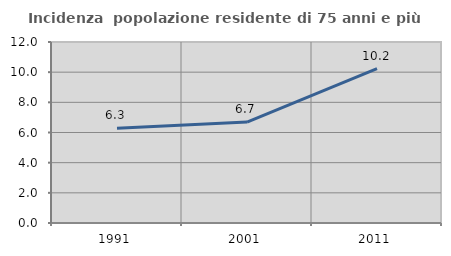
| Category | Incidenza  popolazione residente di 75 anni e più |
|---|---|
| 1991.0 | 6.279 |
| 2001.0 | 6.693 |
| 2011.0 | 10.228 |